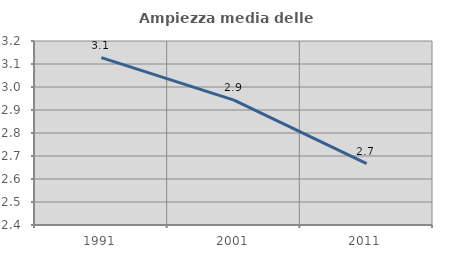
| Category | Ampiezza media delle famiglie |
|---|---|
| 1991.0 | 3.128 |
| 2001.0 | 2.943 |
| 2011.0 | 2.667 |